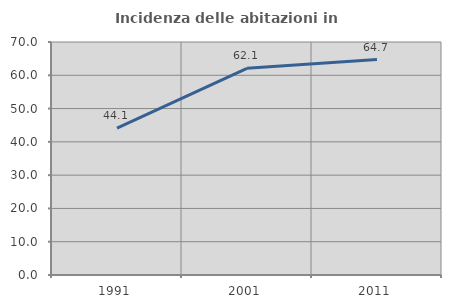
| Category | Incidenza delle abitazioni in proprietà  |
|---|---|
| 1991.0 | 44.118 |
| 2001.0 | 62.097 |
| 2011.0 | 64.723 |